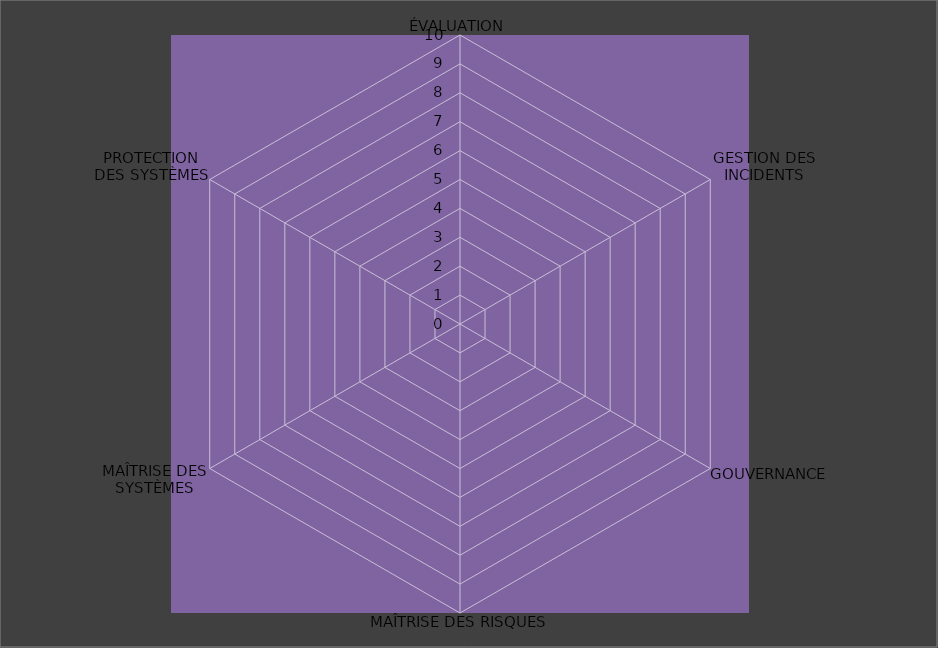
| Category | Année 2021 |
|---|---|
| ÉVALUATION | 0 |
| GESTION DES INCIDENTS | 0 |
| GOUVERNANCE | 0 |
| MAÎTRISE DES RISQUES | 0 |
| MAÎTRISE DES SYSTÈMES | 0 |
| PROTECTION
DES SYSTÈMES | 0 |